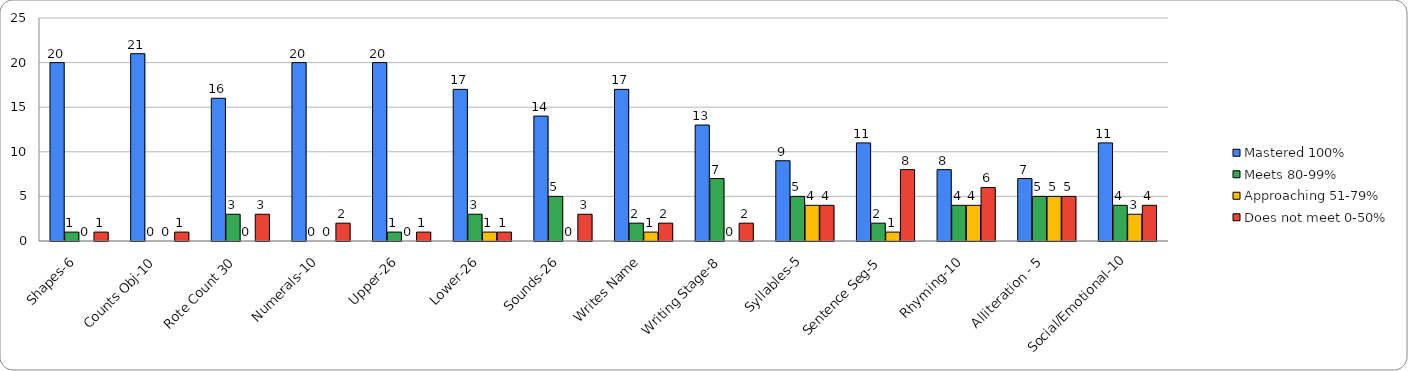
| Category | Mastered 100% | Meets 80-99% | Approaching 51-79% | Does not meet 0-50% |
|---|---|---|---|---|
| Shapes-6 | 20 | 1 | 0 | 1 |
| Counts Obj-10 | 21 | 0 | 0 | 1 |
| Rote Count 30 | 16 | 3 | 0 | 3 |
| Numerals-10 | 20 | 0 | 0 | 2 |
| Upper-26 | 20 | 1 | 0 | 1 |
| Lower-26 | 17 | 3 | 1 | 1 |
| Sounds-26 | 14 | 5 | 0 | 3 |
| Writes Name | 17 | 2 | 1 | 2 |
| Writing Stage-8 | 13 | 7 | 0 | 2 |
| Syllables-5 | 9 | 5 | 4 | 4 |
| Sentence Seg-5 | 11 | 2 | 1 | 8 |
| Rhyming-10 | 8 | 4 | 4 | 6 |
| Alliteration - 5 | 7 | 5 | 5 | 5 |
| Social/Emotional-10 | 11 | 4 | 3 | 4 |